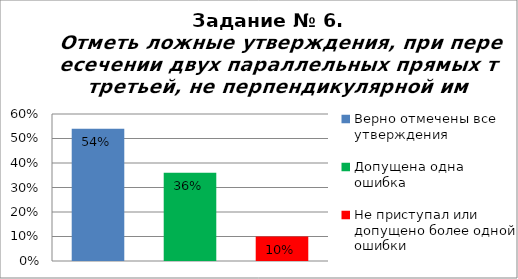
| Category | Отметь ложные утверждения, при пересечении двух параллельных прямых третьей, не перпендикулярной им. |
|---|---|
| Верно отмечены все утверждения | 0.54 |
| Допущена одна ошибка | 0.36 |
| Не приступал или допущено более одной ошибки | 0.1 |